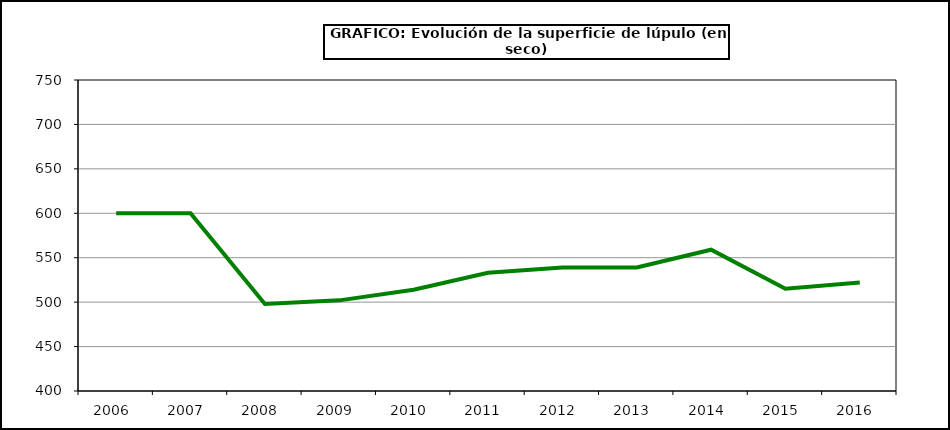
| Category | Superficie |
|---|---|
| 2006.0 | 600 |
| 2007.0 | 600 |
| 2008.0 | 498 |
| 2009.0 | 502 |
| 2010.0 | 514 |
| 2011.0 | 533 |
| 2012.0 | 539 |
| 2013.0 | 539 |
| 2014.0 | 559 |
| 2015.0 | 515 |
| 2016.0 | 522 |